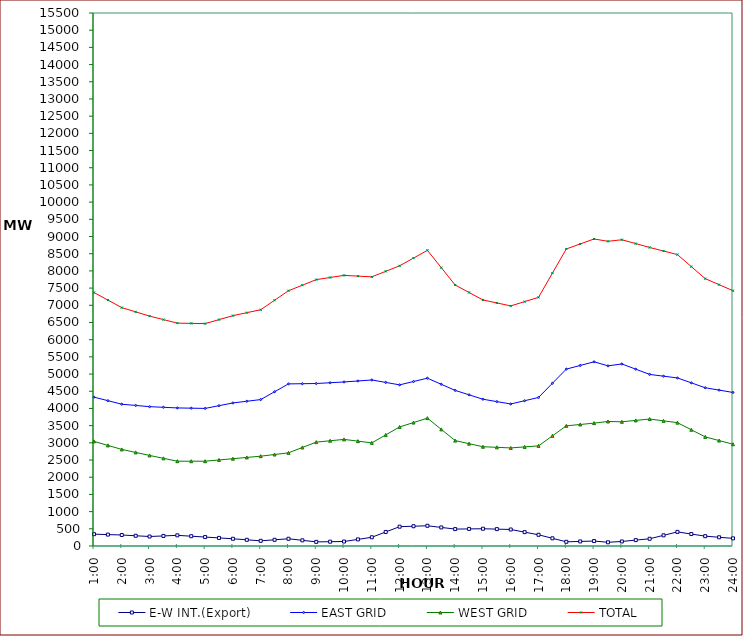
| Category | E-W INT.(Export) | EAST GRID | WEST GRID | TOTAL |
|---|---|---|---|---|
| 1:00 | 344 | 4329 | 3042 | 7371 |
| 1:30 | 332 | 4226 | 2925.5 | 7151.5 |
| 2:00 | 320 | 4123 | 2809 | 6932 |
| 2:30 | 298 | 4087.5 | 2721.5 | 6809 |
| 3:00 | 276 | 4052 | 2634 | 6686 |
| 3:30 | 293 | 4033.5 | 2550 | 6583.5 |
| 4:00 | 310 | 4015 | 2466 | 6481 |
| 4:30 | 285 | 4008 | 2466 | 6474 |
| 5:00 | 260 | 4001 | 2466 | 6467 |
| 5:30 | 235 | 4080.5 | 2502.5 | 6583 |
| 6:00 | 210 | 4160 | 2539 | 6699 |
| 6:30 | 180 | 4209 | 2575.5 | 6784.5 |
| 7:00 | 150 | 4258 | 2612 | 6870 |
| 7:30 | 180 | 4486 | 2660.5 | 7146.5 |
| 8:00 | 210 | 4714 | 2709 | 7423 |
| 8:30 | 165 | 4719.5 | 2865 | 7584.5 |
| 9:00 | 120 | 4725 | 3021 | 7746 |
| 9:30 | 125 | 4747.5 | 3060.5 | 7808 |
| 10:00 | 130 | 4770 | 3100 | 7870 |
| 10:30 | 192 | 4799 | 3049.5 | 7848.5 |
| 11:00 | 254 | 4828 | 2999 | 7827 |
| 11:30 | 408 | 4757 | 3230.5 | 7987.5 |
| 12:00 | 562 | 4686 | 3462 | 8148 |
| 12:30 | 575 | 4783 | 3590 | 8373 |
| 13:00 | 588 | 4880 | 3718 | 8598 |
| 13:30 | 540 | 4702.5 | 3391.5 | 8094 |
| 14:00 | 492 | 4525 | 3065 | 7590 |
| 14:30 | 497 | 4396.5 | 2976 | 7372.5 |
| 15:00 | 502 | 4268 | 2887 | 7155 |
| 15:30 | 491 | 4199 | 2869.5 | 7068.5 |
| 16:00 | 480 | 4130 | 2852 | 6982 |
| 16:30 | 403 | 4224.5 | 2882 | 7106.5 |
| 17:00 | 326 | 4319 | 2912 | 7231 |
| 17:30 | 224 | 4731.5 | 3203 | 7934.5 |
| 18:00 | 122 | 5144 | 3494 | 8638 |
| 18:30 | 133 | 5250 | 3533.5 | 8783.5 |
| 19:00 | 144 | 5356 | 3573 | 8929 |
| 19:30 | 108 | 5239 | 3621 | 8860 |
| 20:00 | 132 | 5294 | 3612 | 8906 |
| 20:30 | 171 | 5142 | 3652 | 8794 |
| 21:00 | 210 | 4990 | 3692 | 8682 |
| 21:30 | 310 | 4938.5 | 3639.5 | 8578 |
| 22:00 | 410 | 4887 | 3587 | 8474 |
| 22:30 | 348 | 4744.5 | 3380 | 8124.5 |
| 23:00 | 286 | 4602 | 3173 | 7775 |
| 23:30 | 254 | 4533.5 | 3066 | 7599.5 |
| 24:00 | 222 | 4465 | 2959 | 7424 |